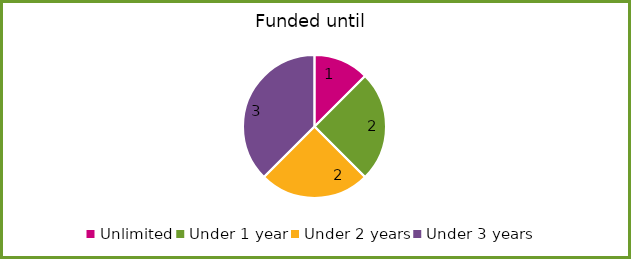
| Category | Series 0 |
|---|---|
| Unlimited | 1 |
| Under 1 year | 2 |
| Under 2 years | 2 |
| Under 3 years | 3 |